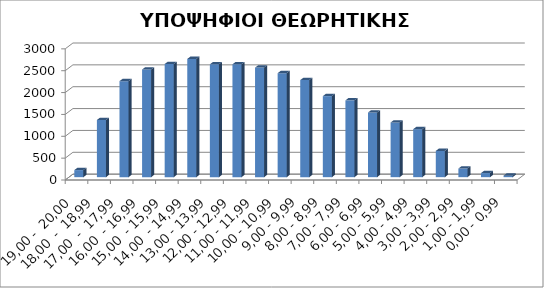
| Category | ΥΠΟΨΗΦΙΟΙ |
|---|---|
| 19,00 -  20,00 | 162 |
| 18,00  -  18,99 | 1308 |
| 17,00  -  17,99 | 2196 |
| 16,00  - 16,99 | 2463 |
| 15,00  - 15,99 | 2588 |
| 14,00  - 14,99 | 2704 |
| 13,00 - 13,99 | 2581 |
| 12,00 - 12,99 | 2582 |
| 11,00 - 11,99 | 2506 |
| 10,00 - 10,99 | 2379 |
| 9,00 - 9,99 | 2221 |
| 8,00 - 8,99 | 1854 |
| 7,00 - 7,99 | 1757 |
| 6,00 - 6,99 | 1479 |
| 5,00 - 5,99 | 1251 |
| 4,00 - 4,99 | 1098 |
| 3,00 - 3,99 | 601 |
| 2,00 - 2,99 | 197 |
| 1,00 - 1,99 | 93 |
| 0,00 - 0,99 | 35 |